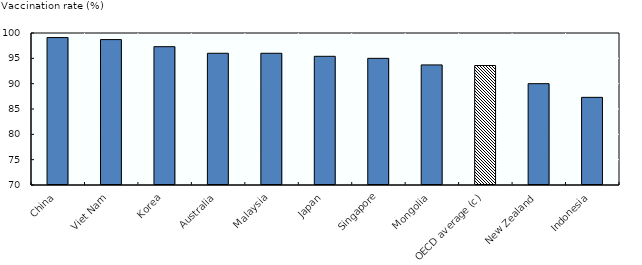
| Category | Series 1 |
|---|---|
| China | 99.1 |
| Viet Nam | 98.7 |
| Korea | 97.3 |
| Australia | 96 |
| Malaysia | 96 |
| Japan | 95.4 |
| Singapore | 95 |
| Mongolia | 93.7 |
| OECD average (c) | 93.584 |
| New Zealand | 90 |
| Indonesia | 87.3 |